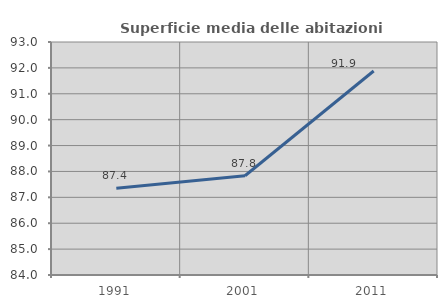
| Category | Superficie media delle abitazioni occupate |
|---|---|
| 1991.0 | 87.352 |
| 2001.0 | 87.834 |
| 2011.0 | 91.879 |